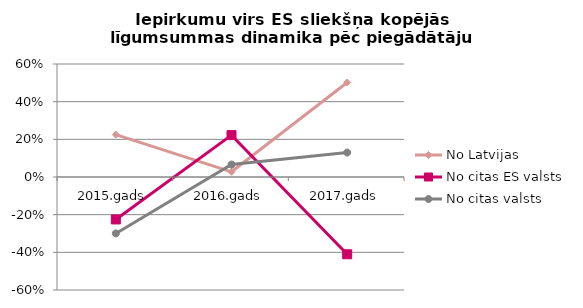
| Category | No Latvijas | No citas ES valsts | No citas valsts |
|---|---|---|---|
| 2015.gads | 0.225 | -0.225 | -0.3 |
| 2016.gads | 0.028 | 0.222 | 0.066 |
| 2017.gads | 0.502 | -0.41 | 0.13 |